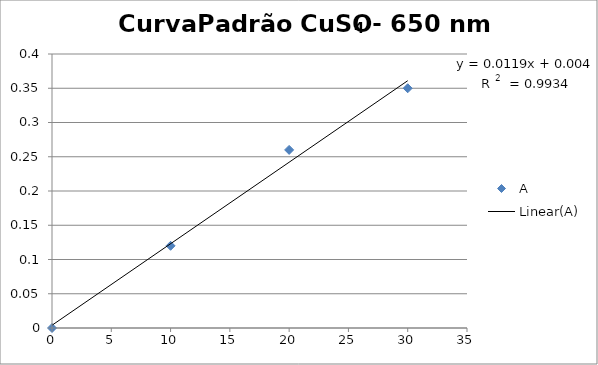
| Category | A |
|---|---|
| 0.0 | 0 |
| 10.0 | 0.12 |
| 20.0 | 0.26 |
| 30.0 | 0.35 |